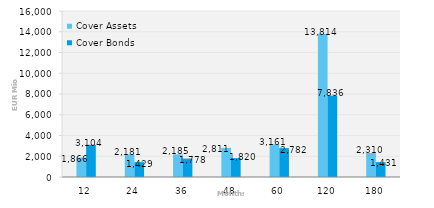
| Category | Cover Assets | Cover Bonds |
|---|---|---|
| 12.0 | 1865.9 | 3104.1 |
| 24.0 | 2180.7 | 1428.7 |
| 36.0 | 2185.2 | 1777.5 |
| 48.0 | 2810.6 | 1820 |
| 60.0 | 3160.8 | 2781.5 |
| 120.0 | 13814.4 | 7835.5 |
| 180.0 | 2309.9 | 1431 |